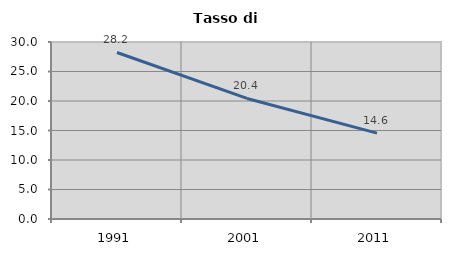
| Category | Tasso di disoccupazione   |
|---|---|
| 1991.0 | 28.223 |
| 2001.0 | 20.435 |
| 2011.0 | 14.563 |